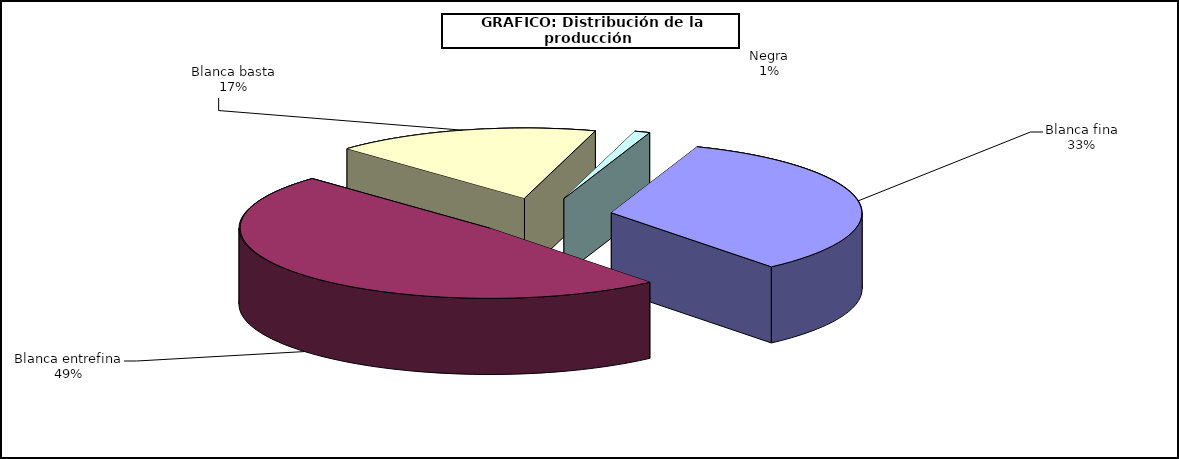
| Category | Series 0 |
|---|---|
| 0 | 7873.832 |
| 1 | 11424.869 |
| 2 | 4020.962 |
| 3 | 234.073 |